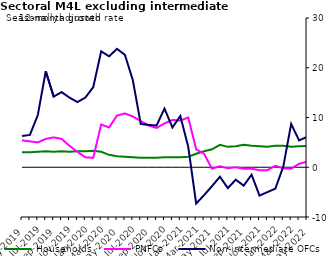
| Category | zero | Households | PNFCs | Non-intermediate OFCs |
|---|---|---|---|---|
| May-2019 | 0 | 3 | 5.4 | 6.3 |
| Jun-2019 | 0 | 3 | 5.2 | 6.5 |
| Jul-2019 | 0 | 3.1 | 5 | 10.5 |
| Aug-2019 | 0 | 3.2 | 5.7 | 19.3 |
| Sep-2019 | 0 | 3.1 | 6 | 14.2 |
| Oct-2019 | 0 | 3.2 | 5.7 | 15.1 |
| Nov-2019 | 0 | 3.1 | 4.3 | 14 |
| Dec-2019 | 0 | 3.2 | 3.1 | 13.1 |
| Jan-2020 | 0 | 3.2 | 2 | 14 |
| Feb-2020 | 0 | 3.3 | 1.9 | 16.1 |
| Mar-2020 | 0 | 3.1 | 8.6 | 23.3 |
| Apr-2020 | 0 | 2.5 | 8 | 22.3 |
| May-2020 | 0 | 2.2 | 10.4 | 23.8 |
| Jun-2020 | 0 | 2.1 | 10.8 | 22.6 |
| Jul-2020 | 0 | 2 | 10.2 | 17.5 |
| Aug-2020 | 0 | 1.9 | 9.3 | 8.7 |
| Sep-2020 | 0 | 1.9 | 8.4 | 8.5 |
| Oct-2020 | 0 | 1.9 | 7.9 | 8.4 |
| Nov-2020 | 0 | 2 | 8.8 | 11.8 |
| Dec-2020 | 0 | 2 | 9.5 | 8 |
| Jan-2021 | 0 | 2 | 9.4 | 10.3 |
| Feb-2021 | 0 | 2.1 | 10 | 4.1 |
| Mar-2021 | 0 | 2.7 | 3.6 | -7.3 |
| Apr-2021 | 0 | 3.2 | 2.7 | -5.6 |
| May-2021 | 0 | 3.6 | -0.3 | -3.8 |
| Jun-2021 | 0 | 4.5 | 0.2 | -1.9 |
| Jul-2021 | 0 | 4.1 | -0.2 | -4.2 |
| Aug-2021 | 0 | 4.2 | 0 | -2.5 |
| Sep-2021 | 0 | 4.5 | -0.3 | -3.7 |
| Oct-2021 | 0 | 4.3 | -0.3 | -1.5 |
| Nov-2021 | 0 | 4.2 | -0.6 | -5.7 |
| Dec-2021 | 0 | 4.1 | -0.6 | -5 |
| Jan-2022 | 0 | 4.3 | 0.3 | -4.3 |
| Feb-2022 | 0 | 4.3 | -0.2 | 0.1 |
| Mar-2022 | 0 | 4.1 | -0.3 | 8.7 |
| Apr-2022 | 0 | 4.2 | 0.7 | 5.4 |
| May-2022 | 0 | 4.3 | 1.1 | 6.1 |